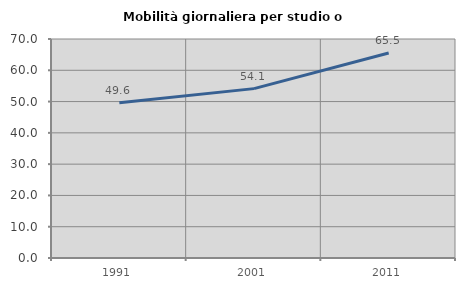
| Category | Mobilità giornaliera per studio o lavoro |
|---|---|
| 1991.0 | 49.621 |
| 2001.0 | 54.138 |
| 2011.0 | 65.549 |